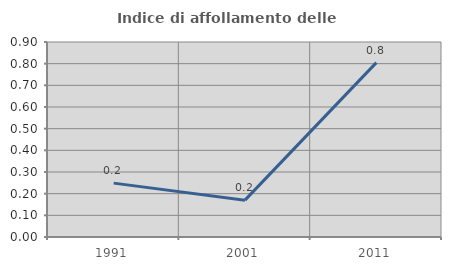
| Category | Indice di affollamento delle abitazioni  |
|---|---|
| 1991.0 | 0.249 |
| 2001.0 | 0.17 |
| 2011.0 | 0.805 |